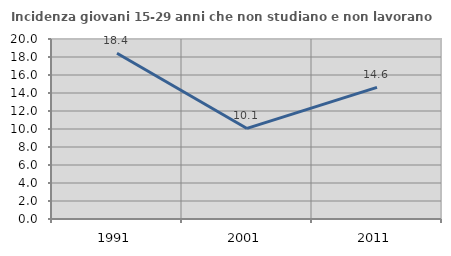
| Category | Incidenza giovani 15-29 anni che non studiano e non lavorano  |
|---|---|
| 1991.0 | 18.417 |
| 2001.0 | 10.064 |
| 2011.0 | 14.627 |